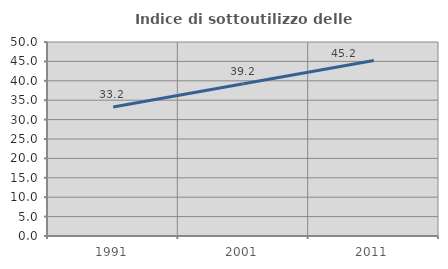
| Category | Indice di sottoutilizzo delle abitazioni  |
|---|---|
| 1991.0 | 33.248 |
| 2001.0 | 39.238 |
| 2011.0 | 45.213 |